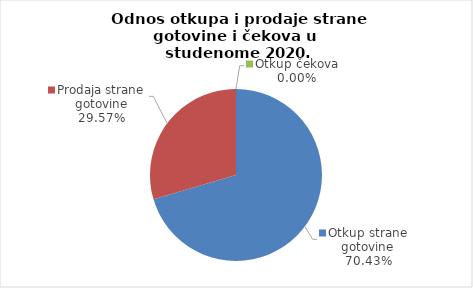
| Category | Series 0 |
|---|---|
| Otkup strane gotovine | 70.433 |
| Prodaja strane gotovine | 29.567 |
| Otkup čekova | 0 |